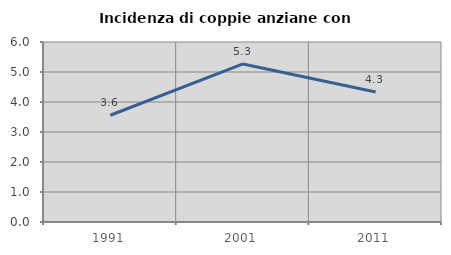
| Category | Incidenza di coppie anziane con figli |
|---|---|
| 1991.0 | 3.559 |
| 2001.0 | 5.27 |
| 2011.0 | 4.334 |